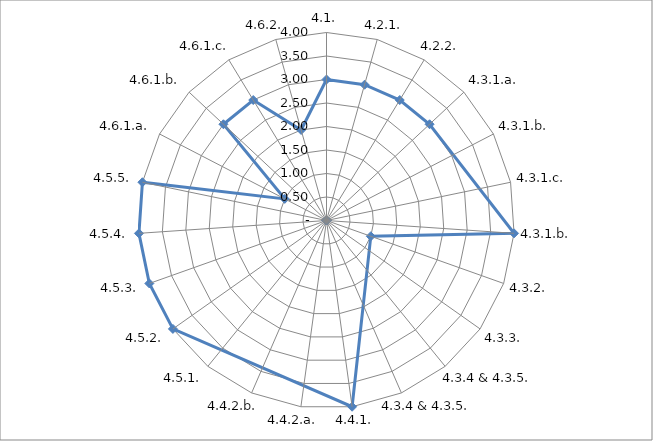
| Category | Series 0 |
|---|---|
| 4.1. | 3 |
| 4.2.1. | 3 |
| 4.2.2. | 3 |
| 4.3.1.a. | 3 |
| 4.3.1.b. | 0 |
| 4.3.1.c. | 0 |
| 4.3.1.b. | 4 |
| 4.3.2. | 1 |
| 4.3.3. | 0 |
| 4.3.4 & 4.3.5. | 0 |
| 4.3.4 & 4.3.5. | 0 |
| 4.4.1. | 4 |
| 4.4.2.a. | 0 |
| 4.4.2.b. | 0 |
| 4.5.1. | 0 |
| 4.5.2. | 4 |
| 4.5.3. | 4 |
| 4.5.4. | 4 |
| 4.5.5. | 4 |
| 4.6.1.a. | 1 |
| 4.6.1.b. | 3 |
| 4.6.1.c. | 3 |
| 4.6.2. | 2 |